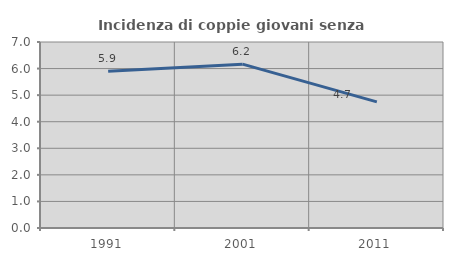
| Category | Incidenza di coppie giovani senza figli |
|---|---|
| 1991.0 | 5.896 |
| 2001.0 | 6.166 |
| 2011.0 | 4.746 |